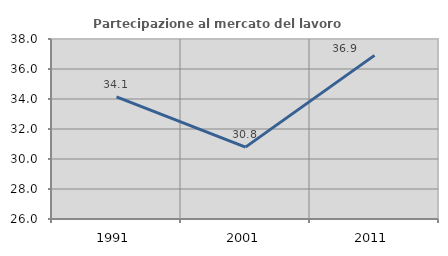
| Category | Partecipazione al mercato del lavoro  femminile |
|---|---|
| 1991.0 | 34.148 |
| 2001.0 | 30.793 |
| 2011.0 | 36.91 |